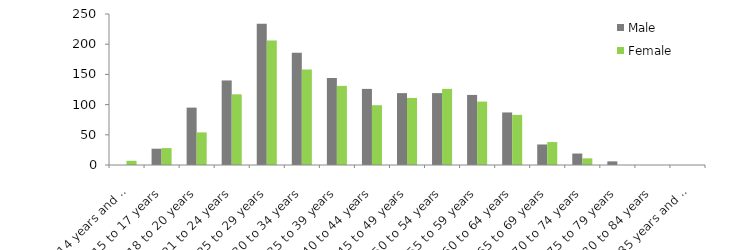
| Category | Male | Female |
|---|---|---|
| 14 years and under | 0 | 7 |
| 15 to 17 years | 27 | 28 |
| 18 to 20 years | 95 | 54 |
| 21 to 24 years | 140 | 117 |
| 25 to 29 years | 234 | 206 |
| 30 to 34 years | 186 | 158 |
| 35 to 39 years | 144 | 131 |
| 40 to 44 years | 126 | 99 |
| 45 to 49 years | 119 | 111 |
| 50 to 54 years | 119 | 126 |
| 55 to 59 years | 116 | 105 |
| 60 to 64 years | 87 | 83 |
| 65 to 69 years | 34 | 38 |
| 70 to 74 years | 19 | 11 |
| 75 to 79 years | 6 | 0 |
| 80 to 84 years | 0 | 0 |
| 85 years and over | 0 | 0 |